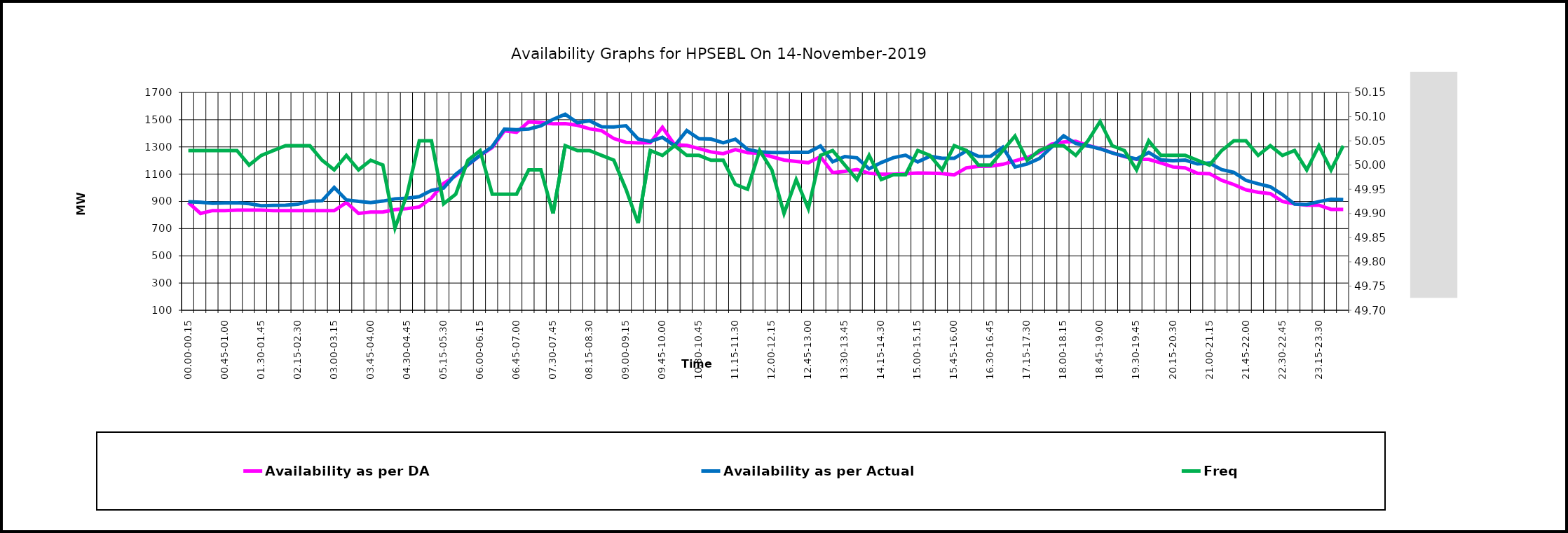
| Category | Availability as per DA | Availability as per Actual |
|---|---|---|
| 00.00-00.15 | 891.263 | 897.411 |
| 00.15-00.30 | 811.36 | 893.078 |
| 00.30-00.45 | 832.16 | 886.394 |
| 00.45-01.00 | 832.16 | 888.487 |
| 01.00-01.15 | 835.562 | 889.493 |
| 01.15-01.30 | 835.562 | 882.833 |
| 01.30-01.45 | 835.562 | 868.069 |
| 01.45-02:00 | 832.167 | 870.721 |
| 02.00-02.15 | 831.393 | 871.494 |
| 02.15-02.30 | 831.393 | 879.141 |
| 02.30-02.45 | 831.393 | 901.503 |
| 02.45-03:00 | 831.393 | 904.503 |
| 03.00-03.15 | 831.571 | 1001.801 |
| 03.15-03.30 | 891.381 | 910.69 |
| 03.30-03.45 | 811.381 | 899.956 |
| 03.45-04.00 | 821.381 | 891.296 |
| 04.00-04.15 | 821.381 | 902.097 |
| 04.15-04.30 | 839.03 | 918.698 |
| 04.30-04.45 | 846.624 | 923.22 |
| 04.45-05.00 | 858.986 | 934.867 |
| 05.00-05.15 | 924.808 | 980.842 |
| 05.15-05.30 | 1031.178 | 998.041 |
| 05.30-05.45 | 1088.179 | 1098.475 |
| 05.45-06.00 | 1166.75 | 1169.014 |
| 06.00-06.15 | 1236.688 | 1237.949 |
| 06.15-06.30 | 1295.057 | 1302.768 |
| 06.30-06.45 | 1417.952 | 1430.353 |
| 06.45-07.00 | 1406.885 | 1426.475 |
| 07.00-07.15 | 1484.396 | 1431.484 |
| 07.15-07.30 | 1478.962 | 1454.98 |
| 07.30-07.45 | 1469.877 | 1502.484 |
| 07.45-08.00 | 1470.5 | 1539.98 |
| 08.00-08.15 | 1459.456 | 1478.321 |
| 08.15-08.30 | 1433.123 | 1492.129 |
| 08.30-08.45 | 1418.865 | 1448.481 |
| 08.45-09.00 | 1361.391 | 1446.969 |
| 09.00-09.15 | 1333.637 | 1455.558 |
| 09.15-09.30 | 1329.191 | 1358.492 |
| 09.30-09.45 | 1330.799 | 1340.318 |
| 09.45-10.00 | 1444.057 | 1370.108 |
| 10.00-10.15 | 1315.344 | 1308.621 |
| 10.15-10.30 | 1311.236 | 1420.026 |
| 10.30-10.45 | 1287.586 | 1360.638 |
| 10.45-11.00 | 1263.231 | 1357.388 |
| 11.00-11.15 | 1250.18 | 1329.862 |
| 11.15-11.30 | 1280.113 | 1356.735 |
| 11.30-11.45 | 1257.496 | 1282.73 |
| 11.45-12.00 | 1253.743 | 1263.465 |
| 12.00-12.15 | 1228.086 | 1259.228 |
| 12.15-12.30 | 1203.523 | 1258.461 |
| 12.30-12.45 | 1193.55 | 1261.236 |
| 12.45-13.00 | 1183.922 | 1260.214 |
| 13.00-13.15 | 1228.787 | 1306.371 |
| 13.15-13.30 | 1111.334 | 1190.515 |
| 13.30-13.45 | 1120.504 | 1229.363 |
| 13.45-14.00 | 1133.931 | 1219.987 |
| 14.00-14.15 | 1106.331 | 1139 |
| 14.15-14.30 | 1099.802 | 1185 |
| 14.30-14.45 | 1098.965 | 1221 |
| 14.45-15.00 | 1102.847 | 1239 |
| 15.00-15.15 | 1108.027 | 1190 |
| 15.15-15.30 | 1106.645 | 1231 |
| 15.30-15.45 | 1104.909 | 1216 |
| 15.45-16.00 | 1094.728 | 1216 |
| 16.00-16.15 | 1146.529 | 1271 |
| 16.15-16.30 | 1157.565 | 1230 |
| 16.30-16.45 | 1158.524 | 1232 |
| 16.45-17.00 | 1172.36 | 1298 |
| 17.00-17.15 | 1197.758 | 1153 |
| 17.15-17.30 | 1221.739 | 1174 |
| 17.30-17.45 | 1259.315 | 1215 |
| 17.45-18.00 | 1319.908 | 1298 |
| 18.00-18.15 | 1335.67 | 1381 |
| 18.15-18.30 | 1340.782 | 1325 |
| 18.30-18.45 | 1310.107 | 1308 |
| 18.45-19.00 | 1288.231 | 1286 |
| 19.00-19.15 | 1257.31 | 1256 |
| 19.15-19.30 | 1229.083 | 1231 |
| 19.30-19.45 | 1208.27 | 1211 |
| 19.45-20.00 | 1208.686 | 1259 |
| 20.00-20.15 | 1181.837 | 1205 |
| 20.15-20.30 | 1152.618 | 1199 |
| 20.30-20.45 | 1145.404 | 1203 |
| 20.45-21.00 | 1106.245 | 1175 |
| 21.00-21.15 | 1103.849 | 1181 |
| 21.15-21.30 | 1054.471 | 1133 |
| 21.30-21.45 | 1023.505 | 1113 |
| 21.45-22.00 | 984.622 | 1054 |
| 22.00-22.15 | 967.179 | 1029 |
| 22.15-22.30 | 956.668 | 1007 |
| 22.30-22.45 | 899.398 | 950 |
| 22.45-23.00 | 881.957 | 880 |
| 23.00-23.15 | 871.963 | 877 |
| 23.15-23.30 | 871.829 | 898 |
| 23.30-23.45 | 841.319 | 915 |
| 23.45-24.00 | 841.319 | 913 |